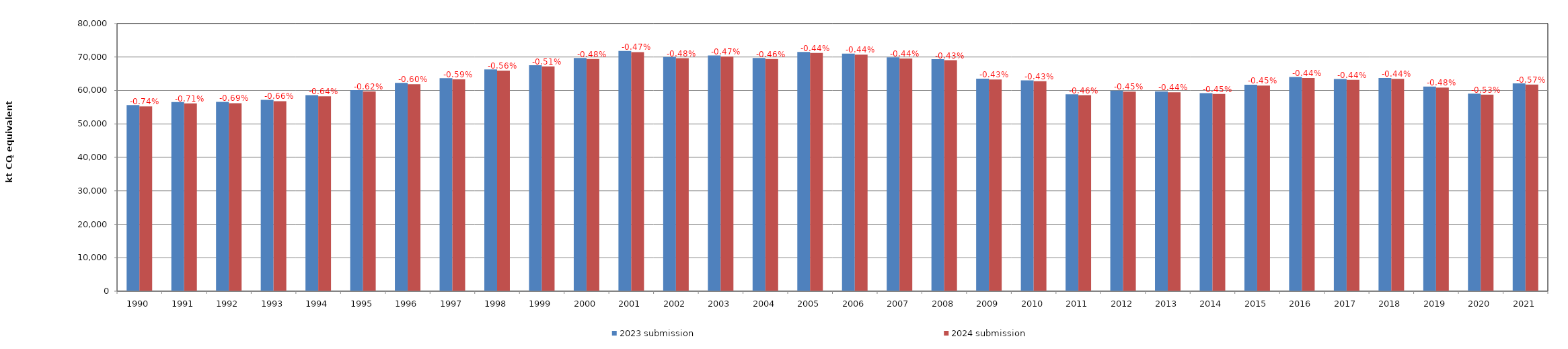
| Category | 2023 submission | 2024 submission |
|---|---|---|
| 1990.0 | 55642.836 | 55231.48 |
| 1991.0 | 56553.463 | 56154.194 |
| 1992.0 | 56589.558 | 56199.408 |
| 1993.0 | 57186.826 | 56807.499 |
| 1994.0 | 58593.624 | 58216.827 |
| 1995.0 | 60080.658 | 59705.977 |
| 1996.0 | 62245.168 | 61869.754 |
| 1997.0 | 63683.616 | 63306.263 |
| 1998.0 | 66292.456 | 65923.564 |
| 1999.0 | 67523.409 | 67182.151 |
| 2000.0 | 69712.382 | 69375.153 |
| 2001.0 | 71814.454 | 71476.888 |
| 2002.0 | 69975.2 | 69638.232 |
| 2003.0 | 70468.497 | 70136.63 |
| 2004.0 | 69723.023 | 69400.748 |
| 2005.0 | 71531.479 | 71213.79 |
| 2006.0 | 71019.463 | 70703.821 |
| 2007.0 | 69874.867 | 69566.109 |
| 2008.0 | 69330.435 | 69032.538 |
| 2009.0 | 63528.259 | 63256.162 |
| 2010.0 | 63032.162 | 62759.68 |
| 2011.0 | 58852.526 | 58582.429 |
| 2012.0 | 59939.507 | 59668.461 |
| 2013.0 | 59711.607 | 59446.155 |
| 2014.0 | 59220.742 | 58952.361 |
| 2015.0 | 61724.028 | 61447.651 |
| 2016.0 | 64005.357 | 63725.095 |
| 2017.0 | 63424.535 | 63148.042 |
| 2018.0 | 63734.108 | 63452.209 |
| 2019.0 | 61165.039 | 60870.806 |
| 2020.0 | 59056.301 | 58745.781 |
| 2021.0 | 62109.869 | 61754.826 |